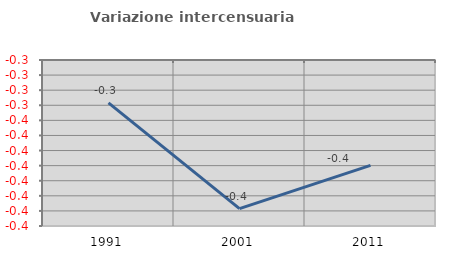
| Category | Variazione intercensuaria annua |
|---|---|
| 1991.0 | -0.338 |
| 2001.0 | -0.409 |
| 2011.0 | -0.38 |